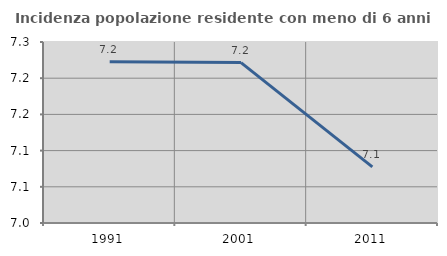
| Category | Incidenza popolazione residente con meno di 6 anni |
|---|---|
| 1991.0 | 7.223 |
| 2001.0 | 7.222 |
| 2011.0 | 7.078 |